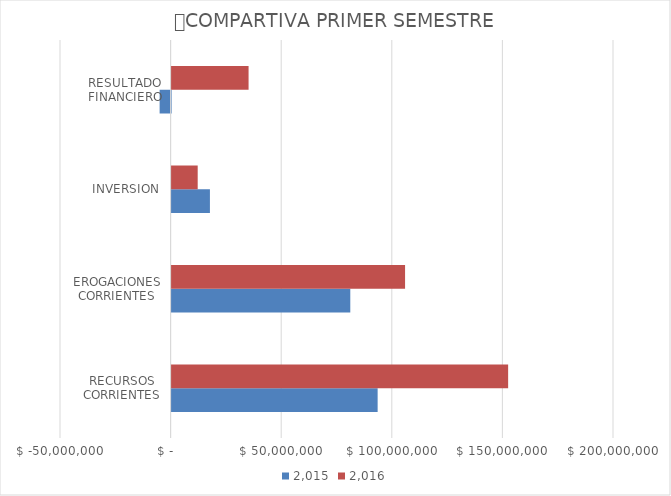
| Category |  2.015  |  2.016  |
|---|---|---|
| RECURSOS CORRIENTES | 93146072.34 | 152143079.94 |
| EROGACIONES CORRIENTES | 80781487.78 | 105545697.9 |
| INVERSION | 17326084.29 | 11797944.16 |
| RESULTADO FINANCIERO | -4961499.73 | 34799437.88 |